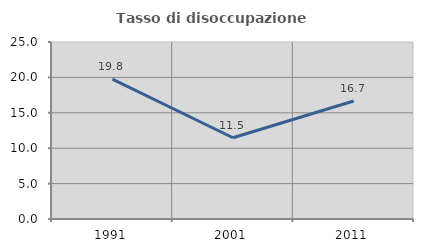
| Category | Tasso di disoccupazione giovanile  |
|---|---|
| 1991.0 | 19.767 |
| 2001.0 | 11.475 |
| 2011.0 | 16.667 |